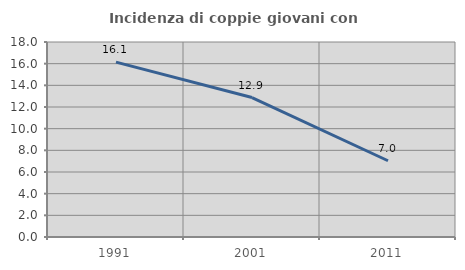
| Category | Incidenza di coppie giovani con figli |
|---|---|
| 1991.0 | 16.143 |
| 2001.0 | 12.87 |
| 2011.0 | 7.039 |